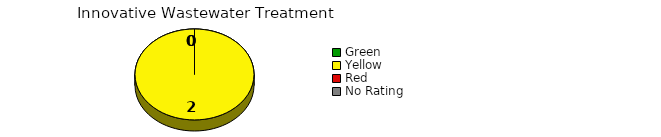
| Category | Counts |
|---|---|
| Green | 0 |
| Yellow | 2 |
| Red | 0 |
| No Rating | 0 |